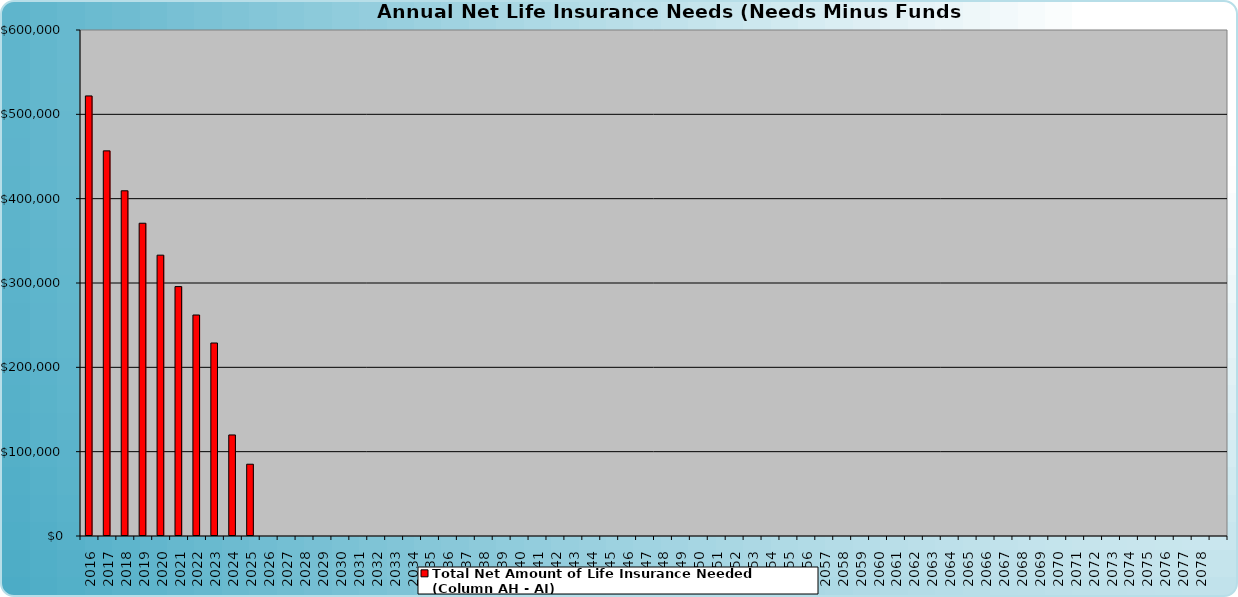
| Category | Total Net Amount of Life Insurance Needed (Column AH - AI) |
|---|---|
| 2016.0 | 521822.454 |
| 2017.0 | 456677.936 |
| 2018.0 | 409344.399 |
| 2019.0 | 370854.571 |
| 2020.0 | 333003.843 |
| 2021.0 | 295731.762 |
| 2022.0 | 262039.847 |
| 2023.0 | 228839.776 |
| 2024.0 | 119812.964 |
| 2025.0 | 85112.523 |
| 2026.0 | 0 |
| 2027.0 | 0 |
| 2028.0 | 0 |
| 2029.0 | 0 |
| 2030.0 | 0 |
| 2031.0 | 0 |
| 2032.0 | 0 |
| 2033.0 | 0 |
| 2034.0 | 0 |
| 2035.0 | 0 |
| 2036.0 | 0 |
| 2037.0 | 0 |
| 2038.0 | 0 |
| 2039.0 | 0 |
| 2040.0 | 0 |
| 2041.0 | 0 |
| 2042.0 | 0 |
| 2043.0 | 0 |
| 2044.0 | 0 |
| 2045.0 | 0 |
| 2046.0 | 0 |
| 2047.0 | 0 |
| 2048.0 | 0 |
| 2049.0 | 0 |
| 2050.0 | 0 |
| 2051.0 | 0 |
| 2052.0 | 0 |
| 2053.0 | 0 |
| 2054.0 | 0 |
| 2055.0 | 0 |
| 2056.0 | 0 |
| 2057.0 | 0 |
| 2058.0 | 0 |
| 2059.0 | 0 |
| 2060.0 | 0 |
| 2061.0 | 0 |
| 2062.0 | 0 |
| 2063.0 | 0 |
| 2064.0 | 0 |
| 2065.0 | 0 |
| 2066.0 | 0 |
| 2067.0 | 0 |
| 2068.0 | 0 |
| 2069.0 | 0 |
| 2070.0 | 0 |
| 2071.0 | 0 |
| 2072.0 | 0 |
| 2073.0 | 0 |
| 2074.0 | 0 |
| 2075.0 | 0 |
| 2076.0 | 0 |
| 2077.0 | 0 |
| 2078.0 | 0 |